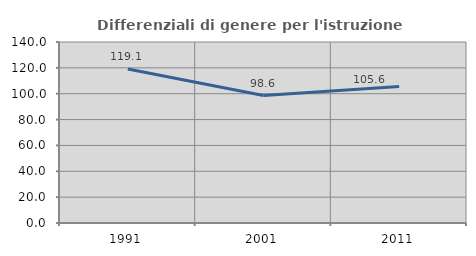
| Category | Differenziali di genere per l'istruzione superiore |
|---|---|
| 1991.0 | 119.1 |
| 2001.0 | 98.605 |
| 2011.0 | 105.641 |